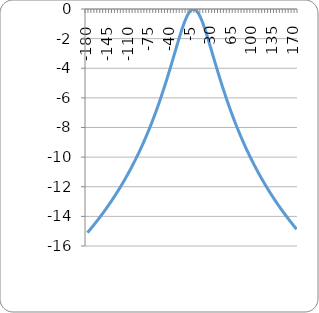
| Category | Output (dB) |
|---|---|
| -180.0 | -15.1 |
| -175.0 | -14.863 |
| -170.0 | -14.62 |
| -165.0 | -14.37 |
| -160.0 | -14.113 |
| -155.0 | -13.848 |
| -150.0 | -13.575 |
| -145.0 | -13.294 |
| -140.0 | -13.004 |
| -135.0 | -12.704 |
| -130.0 | -12.395 |
| -125.0 | -12.075 |
| -120.0 | -11.743 |
| -115.0 | -11.399 |
| -110.0 | -11.042 |
| -105.0 | -10.671 |
| -100.0 | -10.285 |
| -95.0 | -9.883 |
| -90.0 | -9.465 |
| -85.0 | -9.027 |
| -80.0 | -8.57 |
| -75.0 | -8.092 |
| -70.0 | -7.591 |
| -65.0 | -7.067 |
| -60.0 | -6.517 |
| -55.0 | -5.942 |
| -50.0 | -5.34 |
| -45.0 | -4.713 |
| -40.0 | -4.063 |
| -35.0 | -3.396 |
| -30.0 | -2.721 |
| -25.0 | -2.055 |
| -20.0 | -1.421 |
| -15.0 | -0.856 |
| -10.0 | -0.401 |
| -5.0 | -0.104 |
| 0.0 | 0 |
| 5.0 | -0.104 |
| 10.0 | -0.401 |
| 15.0 | -0.856 |
| 20.0 | -1.421 |
| 25.0 | -2.055 |
| 30.0 | -2.721 |
| 35.0 | -3.396 |
| 40.0 | -4.063 |
| 45.0 | -4.713 |
| 50.0 | -5.34 |
| 55.0 | -5.942 |
| 60.0 | -6.517 |
| 65.0 | -7.067 |
| 70.0 | -7.591 |
| 75.0 | -8.092 |
| 80.0 | -8.57 |
| 85.0 | -9.027 |
| 90.0 | -9.465 |
| 95.0 | -9.883 |
| 100.0 | -10.285 |
| 105.0 | -10.671 |
| 110.0 | -11.042 |
| 115.0 | -11.399 |
| 120.0 | -11.743 |
| 125.0 | -12.075 |
| 130.0 | -12.395 |
| 135.0 | -12.704 |
| 140.0 | -13.004 |
| 145.0 | -13.294 |
| 150.0 | -13.575 |
| 155.0 | -13.848 |
| 160.0 | -14.113 |
| 165.0 | -14.37 |
| 170.0 | -14.62 |
| 175.0 | -14.863 |